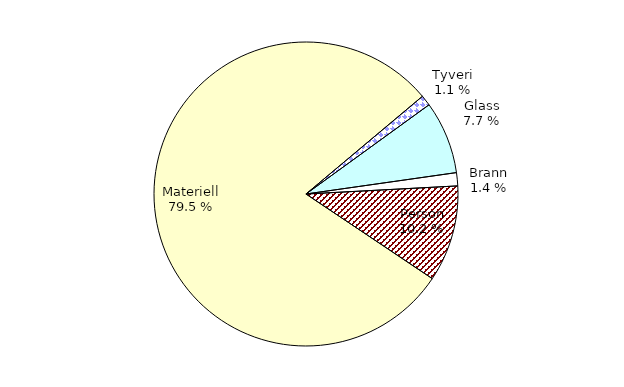
| Category | Series 0 |
|---|---|
| Tyveri | 77.624 |
| Glass | 533.563 |
| Brann | 96.626 |
| Person | 706.646 |
| Materiell | 5482.775 |